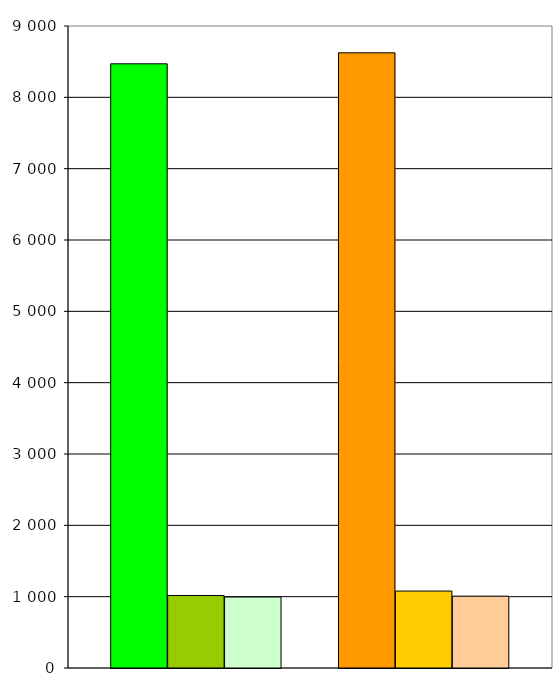
| Category | Series 0 | Series 1 | Series 2 | Series 3 | Series 4 | Series 5 | Series 6 |
|---|---|---|---|---|---|---|---|
| 0 | 8470 | 1016 | 995 |  | 8624 | 1079 | 1007 |